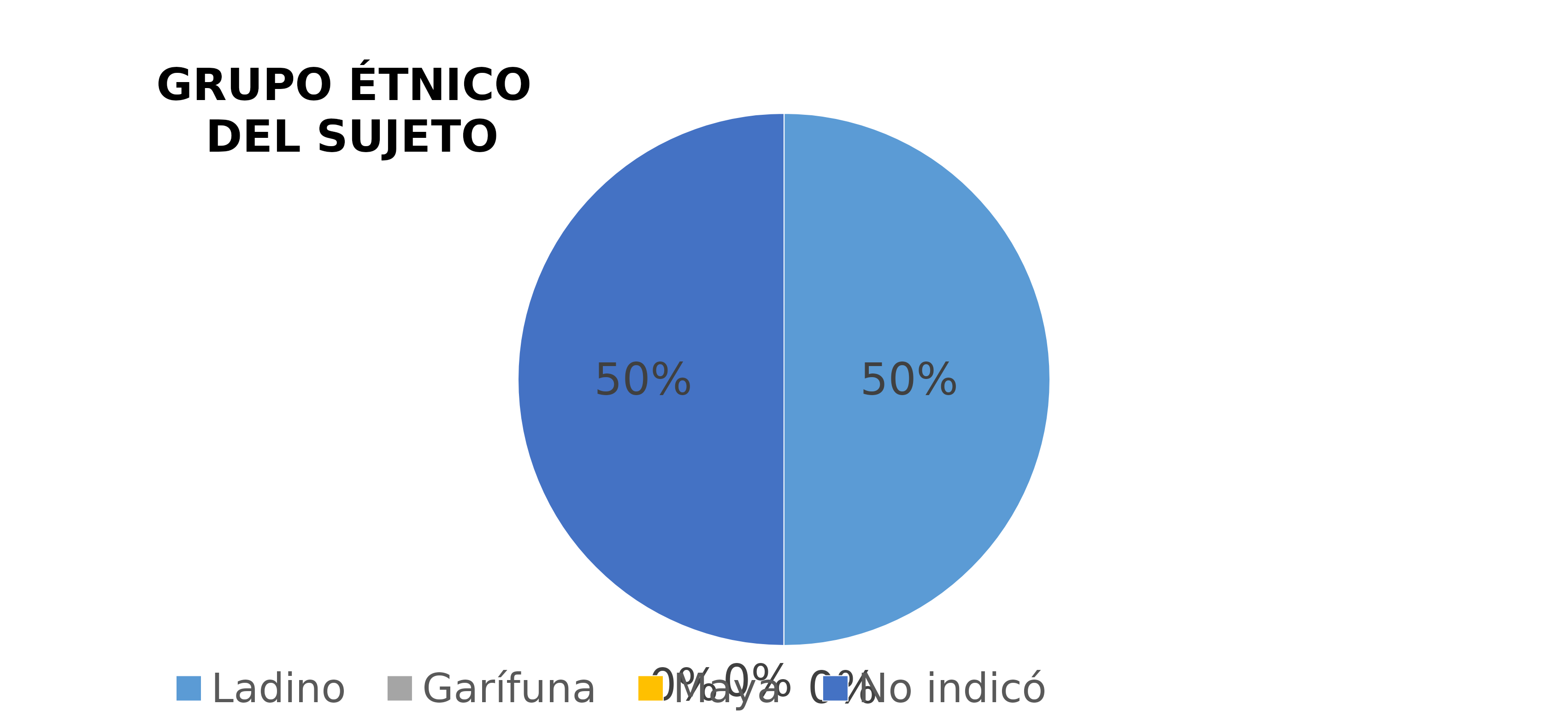
| Category | Series 0 |
|---|---|
| Ladino | 1 |
| Xinca | 0 |
| Garífuna | 0 |
| Maya | 0 |
| No indicó | 1 |